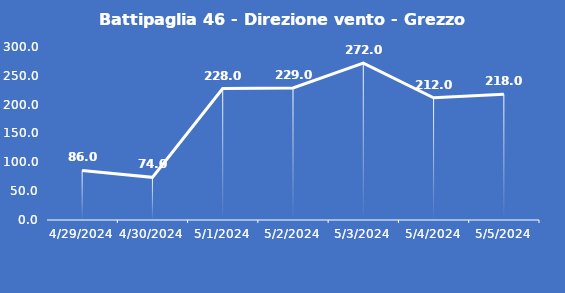
| Category | Battipaglia 46 - Direzione vento - Grezzo (°N) |
|---|---|
| 4/29/24 | 86 |
| 4/30/24 | 74 |
| 5/1/24 | 228 |
| 5/2/24 | 229 |
| 5/3/24 | 272 |
| 5/4/24 | 212 |
| 5/5/24 | 218 |